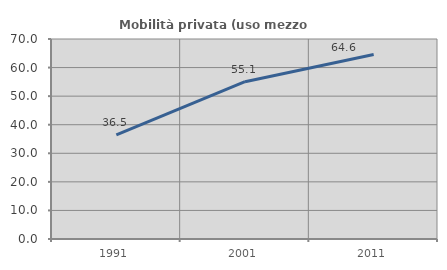
| Category | Mobilità privata (uso mezzo privato) |
|---|---|
| 1991.0 | 36.464 |
| 2001.0 | 55.056 |
| 2011.0 | 64.569 |